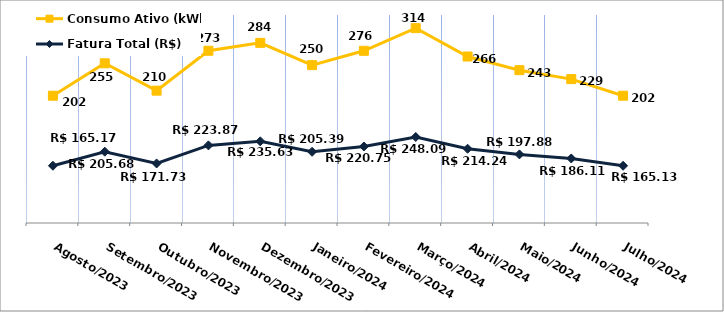
| Category | Fatura Total (R$) | Consumo Ativo (kWh) |
|---|---|---|
| Agosto/2023 | 165.17 | 202 |
| Setembro/2023 | 205.68 | 255 |
| Outubro/2023 | 171.73 | 210 |
| Novembro/2023 | 223.87 | 273 |
| Dezembro/2023 | 235.63 | 284 |
| Janeiro/2024 | 205.39 | 250 |
| Fevereiro/2024 | 220.75 | 276 |
| Março/2024 | 248.09 | 314 |
| Abril/2024 | 214.24 | 266 |
| Maio/2024 | 197.88 | 243 |
| Junho/2024 | 186.11 | 229 |
| Julho/2024 | 165.13 | 202 |